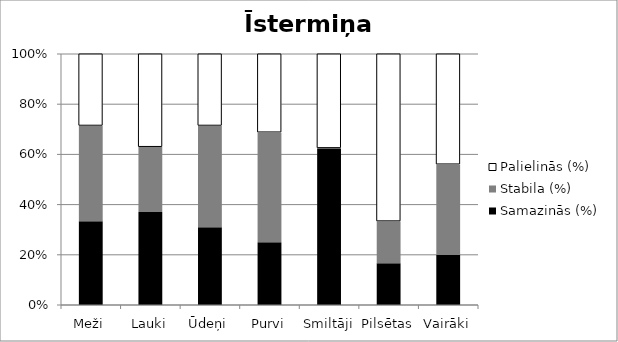
| Category | Samazinās (%) | Stabila (%) | Palielinās (%) |
|---|---|---|---|
| Meži | 0.333 | 0.381 | 0.286 |
| Lauki | 0.37 | 0.259 | 0.37 |
| Ūdeņi | 0.31 | 0.405 | 0.286 |
| Purvi | 0.25 | 0.438 | 0.312 |
| Smiltāji | 0.625 | 0 | 0.375 |
| Pilsētas | 0.167 | 0.167 | 0.667 |
| Vairāki | 0.2 | 0.36 | 0.44 |